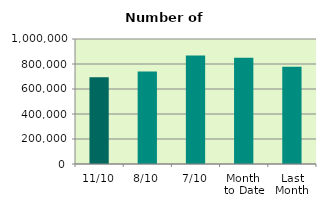
| Category | Series 0 |
|---|---|
| 11/10 | 693746 |
| 8/10 | 739320 |
| 7/10 | 867078 |
| Month 
to Date | 850664.857 |
| Last
Month | 778605.273 |